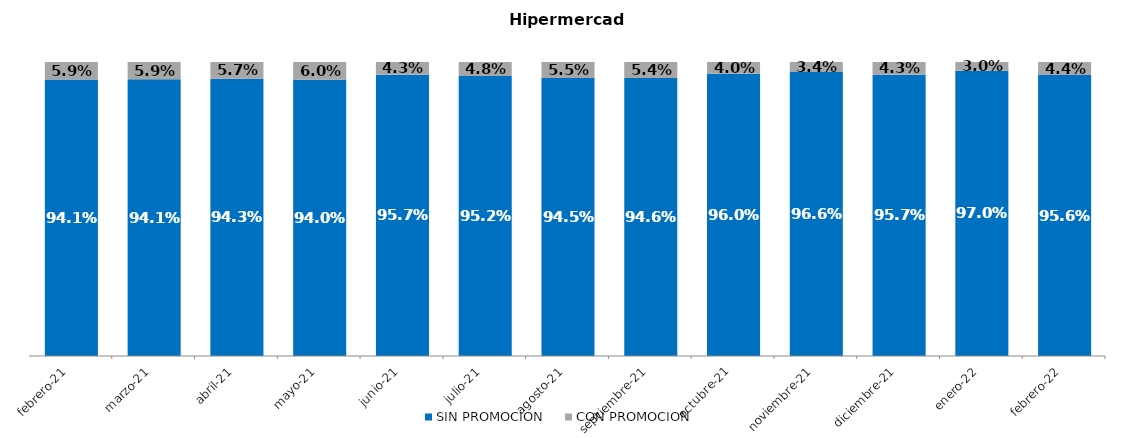
| Category | SIN PROMOCION   | CON PROMOCION   |
|---|---|---|
| 2021-02-01 | 0.941 | 0.059 |
| 2021-03-01 | 0.941 | 0.059 |
| 2021-04-01 | 0.943 | 0.057 |
| 2021-05-01 | 0.94 | 0.06 |
| 2021-06-01 | 0.957 | 0.043 |
| 2021-07-01 | 0.952 | 0.048 |
| 2021-08-01 | 0.945 | 0.055 |
| 2021-09-01 | 0.946 | 0.054 |
| 2021-10-01 | 0.96 | 0.04 |
| 2021-11-01 | 0.966 | 0.034 |
| 2021-12-01 | 0.957 | 0.043 |
| 2022-01-01 | 0.97 | 0.03 |
| 2022-02-01 | 0.956 | 0.044 |